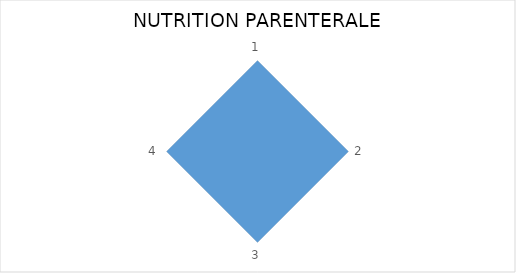
| Category | Series 0 |
|---|---|
| 0 | 1 |
| 1 | 1 |
| 2 | 1 |
| 3 | 1 |